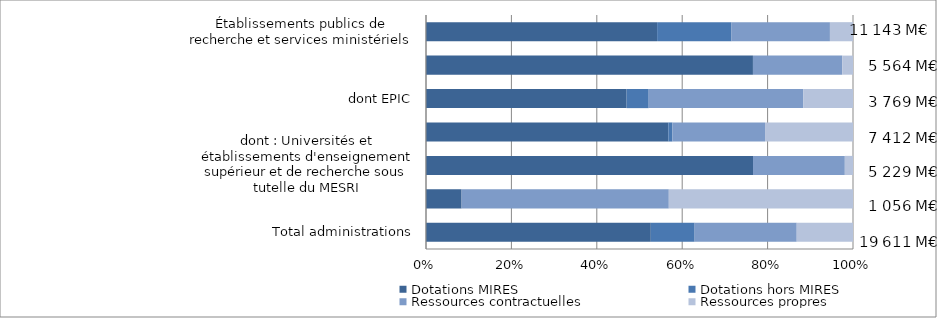
| Category | Dotations MIRES | Dotations hors MIRES | Ressources contractuelles | Ressources propres |
|---|---|---|---|---|
| Total administrations | 52.649 | 10.269 | 23.905 | 13.177 |
| Institutions sans but lucratif | 8.337 | 0 | 48.527 | 43.137 |
| dont : Universités et établissements d'enseignement supérieur et de recherche sous tutelle du MESRI | 76.585 | 0 | 21.501 | 1.915 |
| Établissements d'enseignement supérieur et de recherche | 56.746 | 0.965 | 21.69 | 20.599 |
| dont EPIC | 46.983 | 5.173 | 36.185 | 11.659 |
| dont EPST (y compris le CNRS) | 76.568 | 0 | 20.914 | 2.517 |
| Établissements publics de recherche et services ministériels | 54.124 | 17.431 | 23.044 | 5.401 |